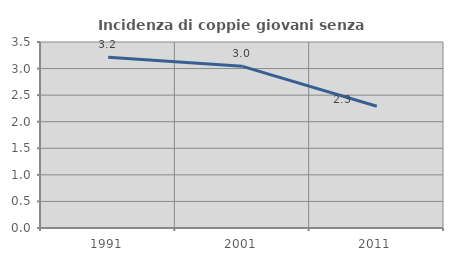
| Category | Incidenza di coppie giovani senza figli |
|---|---|
| 1991.0 | 3.214 |
| 2001.0 | 3.042 |
| 2011.0 | 2.292 |